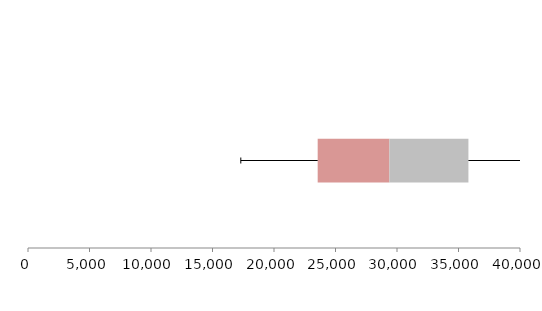
| Category | Series 1 | Series 2 | Series 3 |
|---|---|---|---|
| 0 | 23551.666 | 5830.488 | 6424.371 |